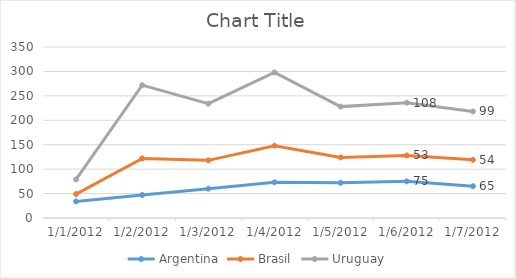
| Category | Argentina | Brasil | Uruguay |
|---|---|---|---|
| 1/1/12 | 34 | 15 | 30 |
| 1/2/12 | 47 | 75 | 150 |
| 1/3/12 | 60 | 58 | 116 |
| 1/4/12 | 73 | 75 | 150 |
| 1/5/12 | 72 | 52 | 104 |
| 1/6/12 | 75 | 53 | 108 |
| 1/7/12 | 65 | 54 | 99 |